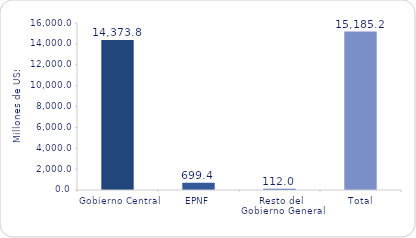
| Category | Series 1 |
|---|---|
| Gobierno Central | 14373.8 |
| EPNF | 699.4 |
| Resto del Gobierno General | 112 |
| Total | 15185.2 |